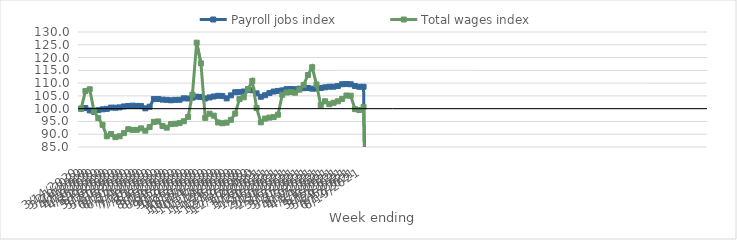
| Category | Payroll jobs index | Total wages index |
|---|---|---|
| 14/03/2020 | 100 | 100 |
| 21/03/2020 | 100.218 | 106.894 |
| 28/03/2020 | 99.312 | 107.598 |
| 04/04/2020 | 98.775 | 99.15 |
| 11/04/2020 | 99.411 | 96.341 |
| 18/04/2020 | 99.751 | 93.672 |
| 25/04/2020 | 99.921 | 89.182 |
| 02/05/2020 | 100.42 | 90.066 |
| 09/05/2020 | 100.377 | 88.852 |
| 16/05/2020 | 100.502 | 89.207 |
| 23/05/2020 | 100.867 | 90.425 |
| 30/05/2020 | 101.043 | 91.955 |
| 06/06/2020 | 101.174 | 91.708 |
| 13/06/2020 | 101.078 | 91.712 |
| 20/06/2020 | 101.014 | 92.295 |
| 27/06/2020 | 100.129 | 91.381 |
| 04/07/2020 | 100.759 | 92.772 |
| 11/07/2020 | 103.771 | 94.839 |
| 18/07/2020 | 103.769 | 95.008 |
| 25/07/2020 | 103.546 | 93.223 |
| 01/08/2020 | 103.453 | 92.563 |
| 08/08/2020 | 103.284 | 93.968 |
| 15/08/2020 | 103.458 | 94.084 |
| 22/08/2020 | 103.495 | 94.339 |
| 29/08/2020 | 104.069 | 95.073 |
| 05/09/2020 | 103.973 | 96.777 |
| 12/09/2020 | 104.305 | 105.484 |
| 19/09/2020 | 104.704 | 125.83 |
| 26/09/2020 | 104.545 | 117.725 |
| 03/10/2020 | 103.973 | 96.401 |
| 10/10/2020 | 104.394 | 98.033 |
| 17/10/2020 | 104.76 | 97.276 |
| 24/10/2020 | 105.039 | 94.595 |
| 31/10/2020 | 104.975 | 94.29 |
| 07/11/2020 | 104.028 | 94.534 |
| 14/11/2020 | 105.209 | 95.635 |
| 21/11/2020 | 106.423 | 98.068 |
| 28/11/2020 | 106.474 | 103.741 |
| 05/12/2020 | 106.712 | 104.46 |
| 12/12/2020 | 107.362 | 107.674 |
| 19/12/2020 | 107.194 | 110.841 |
| 26/12/2020 | 105.999 | 100.263 |
| 02/01/2021 | 104.654 | 94.65 |
| 09/01/2021 | 105.258 | 96.124 |
| 16/01/2021 | 106.091 | 96.501 |
| 23/01/2021 | 106.702 | 96.71 |
| 30/01/2021 | 106.932 | 97.626 |
| 06/02/2021 | 107.154 | 105.428 |
| 13/02/2021 | 107.644 | 106.321 |
| 20/02/2021 | 107.702 | 106.478 |
| 27/02/2021 | 107.604 | 106.247 |
| 06/03/2021 | 107.809 | 107.422 |
| 13/03/2021 | 108.012 | 109.297 |
| 20/03/2021 | 108.081 | 113.183 |
| 27/03/2021 | 107.824 | 116.224 |
| 03/04/2021 | 107.872 | 109.483 |
| 10/04/2021 | 108.076 | 101.363 |
| 17/04/2021 | 108.351 | 102.896 |
| 24/04/2021 | 108.589 | 101.736 |
| 01/05/2021 | 108.606 | 102.318 |
| 08/05/2021 | 108.877 | 102.89 |
| 15/05/2021 | 109.564 | 103.798 |
| 22/05/2021 | 109.629 | 105.134 |
| 29/05/2021 | 109.545 | 105.05 |
| 05/06/2021 | 108.852 | 99.822 |
| 12/06/2021 | 108.567 | 99.462 |
| 19/06/2021 | 108.577 | 100.641 |